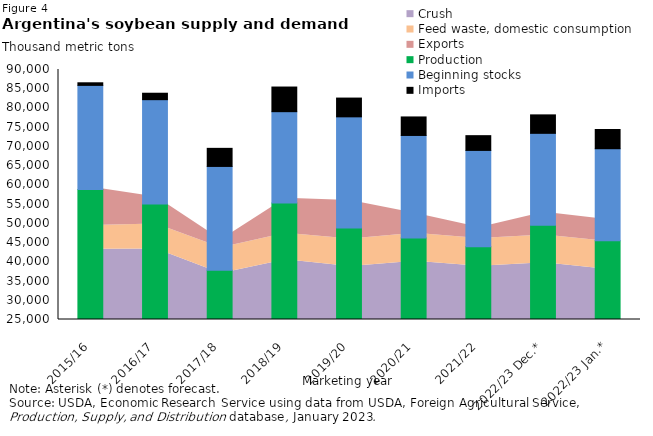
| Category | Production | Beginning stocks | Imports |
|---|---|---|---|
| 2015/16 | 58800 | 27069 | 676 |
| 2016/17 | 55000 | 27156 | 1674 |
| 2017/18 | 37800 | 26996 | 4703 |
| 2018/19 | 55300 | 23734 | 6408 |
| 2019/20 | 48800 | 28890 | 4882 |
| 2020/21 | 46200 | 26650 | 4816 |
| 2021/22 | 43900 | 25060 | 3839 |
| 2022/23 Dec.* | 49500 | 23903 | 4800 |
| 2022/23 Jan.* | 45500 | 23903 | 5000 |